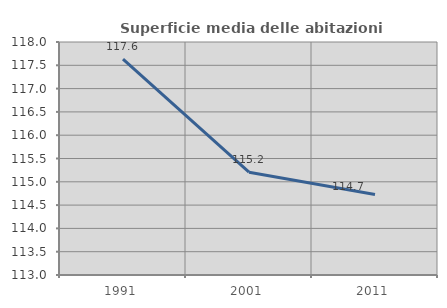
| Category | Superficie media delle abitazioni occupate |
|---|---|
| 1991.0 | 117.631 |
| 2001.0 | 115.206 |
| 2011.0 | 114.728 |